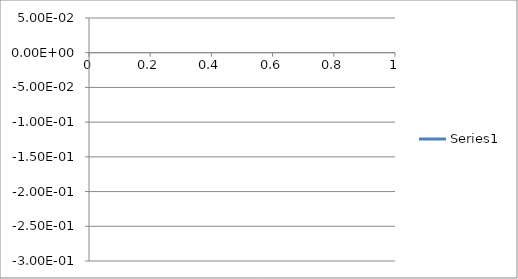
| Category | Series 0 |
|---|---|
| 0 | 0.008 |
| 1 | 0.008 |
| 2 | 0.008 |
| 3 | 0.008 |
| 4 | 0.008 |
| 5 | 0.008 |
| 6 | 0.008 |
| 7 | 0.008 |
| 8 | 0.008 |
| 9 | 0.007 |
| 10 | 0.007 |
| 11 | 0.007 |
| 12 | 0.007 |
| 13 | 0.007 |
| 14 | 0.007 |
| 15 | 0.008 |
| 16 | 0.008 |
| 17 | 0.008 |
| 18 | 0.008 |
| 19 | 0.008 |
| 20 | 0.008 |
| 21 | 0.008 |
| 22 | 0.008 |
| 23 | 0.008 |
| 24 | 0.008 |
| 25 | 0.008 |
| 26 | 0.008 |
| 27 | 0.008 |
| 28 | 0.008 |
| 29 | 0.008 |
| 30 | 0.008 |
| 31 | 0.008 |
| 32 | 0.008 |
| 33 | 0.008 |
| 34 | 0.008 |
| 35 | 0.008 |
| 36 | 0.008 |
| 37 | 0.008 |
| 38 | 0.008 |
| 39 | 0.008 |
| 40 | 0.008 |
| 41 | 0.007 |
| 42 | 0.007 |
| 43 | 0.007 |
| 44 | 0.007 |
| 45 | 0.007 |
| 46 | 0.007 |
| 47 | 0.007 |
| 48 | 0.007 |
| 49 | 0.007 |
| 50 | 0.007 |
| 51 | 0.007 |
| 52 | 0.007 |
| 53 | 0.007 |
| 54 | 0.007 |
| 55 | 0.007 |
| 56 | 0.007 |
| 57 | 0.007 |
| 58 | 0.007 |
| 59 | 0.007 |
| 60 | 0.007 |
| 61 | 0.007 |
| 62 | 0.007 |
| 63 | 0.007 |
| 64 | 0.007 |
| 65 | 0.007 |
| 66 | 0.006 |
| 67 | 0.004 |
| 68 | 0 |
| 69 | -0.006 |
| 70 | -0.015 |
| 71 | -0.027 |
| 72 | -0.042 |
| 73 | -0.057 |
| 74 | -0.072 |
| 75 | -0.086 |
| 76 | -0.1 |
| 77 | -0.117 |
| 78 | -0.138 |
| 79 | -0.16 |
| 80 | -0.183 |
| 81 | -0.204 |
| 82 | -0.223 |
| 83 | -0.238 |
| 84 | -0.248 |
| 85 | -0.253 |
| 86 | -0.251 |
| 87 | -0.244 |
| 88 | -0.232 |
| 89 | -0.218 |
| 90 | -0.202 |
| 91 | -0.185 |
| 92 | -0.17 |
| 93 | -0.157 |
| 94 | -0.149 |
| 95 | -0.145 |
| 96 | -0.145 |
| 97 | -0.148 |
| 98 | -0.151 |
| 99 | -0.152 |
| 100 | -0.152 |
| 101 | -0.148 |
| 102 | -0.142 |
| 103 | -0.133 |
| 104 | -0.124 |
| 105 | -0.115 |
| 106 | -0.108 |
| 107 | -0.103 |
| 108 | -0.101 |
| 109 | -0.1 |
| 110 | -0.1 |
| 111 | -0.099 |
| 112 | -0.099 |
| 113 | -0.099 |
| 114 | -0.098 |
| 115 | -0.097 |
| 116 | -0.097 |
| 117 | -0.096 |
| 118 | -0.095 |
| 119 | -0.095 |
| 120 | -0.094 |
| 121 | -0.093 |
| 122 | -0.092 |
| 123 | -0.091 |
| 124 | -0.09 |
| 125 | -0.089 |
| 126 | -0.086 |
| 127 | -0.083 |
| 128 | -0.079 |
| 129 | -0.074 |
| 130 | -0.068 |
| 131 | -0.063 |
| 132 | -0.059 |
| 133 | -0.055 |
| 134 | -0.052 |
| 135 | -0.05 |
| 136 | -0.049 |
| 137 | -0.049 |
| 138 | -0.049 |
| 139 | -0.05 |
| 140 | -0.051 |
| 141 | -0.052 |
| 142 | -0.052 |
| 143 | -0.052 |
| 144 | -0.052 |
| 145 | -0.052 |
| 146 | -0.052 |
| 147 | -0.051 |
| 148 | -0.051 |
| 149 | -0.051 |
| 150 | -0.05 |
| 151 | -0.049 |
| 152 | -0.048 |
| 153 | -0.046 |
| 154 | -0.043 |
| 155 | -0.041 |
| 156 | -0.038 |
| 157 | -0.035 |
| 158 | -0.032 |
| 159 | -0.029 |
| 160 | -0.027 |
| 161 | -0.026 |
| 162 | -0.025 |
| 163 | -0.025 |
| 164 | -0.024 |
| 165 | -0.024 |
| 166 | -0.025 |
| 167 | -0.025 |
| 168 | -0.025 |
| 169 | -0.025 |
| 170 | -0.025 |
| 171 | -0.026 |
| 172 | -0.026 |
| 173 | -0.028 |
| 174 | -0.029 |
| 175 | -0.032 |
| 176 | -0.034 |
| 177 | -0.036 |
| 178 | -0.038 |
| 179 | -0.039 |
| 180 | -0.039 |
| 181 | -0.038 |
| 182 | -0.037 |
| 183 | -0.034 |
| 184 | -0.031 |
| 185 | -0.028 |
| 186 | -0.025 |
| 187 | -0.022 |
| 188 | -0.019 |
| 189 | -0.016 |
| 190 | -0.014 |
| 191 | -0.011 |
| 192 | -0.008 |
| 193 | -0.007 |
| 194 | -0.006 |
| 195 | -0.005 |
| 196 | -0.006 |
| 197 | -0.006 |
| 198 | -0.007 |
| 199 | -0.008 |
| 200 | -0.009 |
| 201 | -0.01 |
| 202 | -0.012 |
| 203 | -0.013 |
| 204 | -0.015 |
| 205 | -0.017 |
| 206 | -0.018 |
| 207 | -0.019 |
| 208 | -0.02 |
| 209 | -0.02 |
| 210 | -0.02 |
| 211 | -0.02 |
| 212 | -0.019 |
| 213 | -0.019 |
| 214 | -0.019 |
| 215 | -0.019 |
| 216 | -0.019 |
| 217 | -0.018 |
| 218 | -0.017 |
| 219 | -0.016 |
| 220 | -0.016 |
| 221 | -0.015 |
| 222 | -0.014 |
| 223 | -0.013 |
| 224 | -0.012 |
| 225 | -0.011 |
| 226 | -0.01 |
| 227 | -0.009 |
| 228 | -0.008 |
| 229 | -0.008 |
| 230 | -0.008 |
| 231 | -0.008 |
| 232 | -0.008 |
| 233 | -0.009 |
| 234 | -0.009 |
| 235 | -0.01 |
| 236 | -0.01 |
| 237 | -0.009 |
| 238 | -0.009 |
| 239 | -0.008 |
| 240 | -0.007 |
| 241 | -0.007 |
| 242 | -0.006 |
| 243 | -0.005 |
| 244 | -0.004 |
| 245 | -0.003 |
| 246 | -0.002 |
| 247 | 0 |
| 248 | 0.001 |
| 249 | 0.002 |
| 250 | 0.002 |
| 251 | 0.002 |
| 252 | 0.002 |
| 253 | 0.002 |
| 254 | 0.001 |
| 255 | 0.001 |
| 256 | 0.001 |
| 257 | 0 |
| 258 | -0.001 |
| 259 | -0.001 |
| 260 | -0.002 |
| 261 | -0.003 |
| 262 | -0.004 |
| 263 | -0.004 |
| 264 | -0.004 |
| 265 | -0.004 |
| 266 | -0.004 |
| 267 | -0.004 |
| 268 | -0.003 |
| 269 | -0.002 |
| 270 | -0.001 |
| 271 | 0 |
| 272 | 0.001 |
| 273 | 0.002 |
| 274 | 0.003 |
| 275 | 0.004 |
| 276 | 0.005 |
| 277 | 0.006 |
| 278 | 0.006 |
| 279 | 0.007 |
| 280 | 0.008 |
| 281 | 0.008 |
| 282 | 0.009 |
| 283 | 0.009 |
| 284 | 0.009 |
| 285 | 0.009 |
| 286 | 0.008 |
| 287 | 0.008 |
| 288 | 0.007 |
| 289 | 0.006 |
| 290 | 0.006 |
| 291 | 0.005 |
| 292 | 0.005 |
| 293 | 0.004 |
| 294 | 0.004 |
| 295 | 0.003 |
| 296 | 0.003 |
| 297 | 0.002 |
| 298 | 0.002 |
| 299 | 0.002 |
| 300 | 0.003 |
| 301 | 0.003 |
| 302 | 0.004 |
| 303 | 0.004 |
| 304 | 0.005 |
| 305 | 0.006 |
| 306 | 0.006 |
| 307 | 0.007 |
| 308 | 0.007 |
| 309 | 0.007 |
| 310 | 0.008 |
| 311 | 0.008 |
| 312 | 0.008 |
| 313 | 0.008 |
| 314 | 0.008 |
| 315 | 0.008 |
| 316 | 0.007 |
| 317 | 0.007 |
| 318 | 0.006 |
| 319 | 0.005 |
| 320 | 0.004 |
| 321 | 0.003 |
| 322 | 0.003 |
| 323 | 0.002 |
| 324 | 0.002 |
| 325 | 0.001 |
| 326 | 0.001 |
| 327 | 0.001 |
| 328 | 0.002 |
| 329 | 0.002 |
| 330 | 0.002 |
| 331 | 0.003 |
| 332 | 0.003 |
| 333 | 0.004 |
| 334 | 0.004 |
| 335 | 0.005 |
| 336 | 0.006 |
| 337 | 0.007 |
| 338 | 0.007 |
| 339 | 0.008 |
| 340 | 0.008 |
| 341 | 0.008 |
| 342 | 0.009 |
| 343 | 0.009 |
| 344 | 0.009 |
| 345 | 0.009 |
| 346 | 0.009 |
| 347 | 0.009 |
| 348 | 0.009 |
| 349 | 0.009 |
| 350 | 0.009 |
| 351 | 0.009 |
| 352 | 0.009 |
| 353 | 0.009 |
| 354 | 0.009 |
| 355 | 0.009 |
| 356 | 0.009 |
| 357 | 0.009 |
| 358 | 0.009 |
| 359 | 0.009 |
| 360 | 0.009 |
| 361 | 0.009 |
| 362 | 0.009 |
| 363 | 0.009 |
| 364 | 0.009 |
| 365 | 0.009 |
| 366 | 0.009 |
| 367 | 0.009 |
| 368 | 0.009 |
| 369 | 0.009 |
| 370 | 0.009 |
| 371 | 0.009 |
| 372 | 0.009 |
| 373 | 0.009 |
| 374 | 0.009 |
| 375 | 0.009 |
| 376 | 0.009 |
| 377 | 0.009 |
| 378 | 0.009 |
| 379 | 0.009 |
| 380 | 0.009 |
| 381 | 0.009 |
| 382 | 0.009 |
| 383 | 0.009 |
| 384 | 0.009 |
| 385 | 0.009 |
| 386 | 0.009 |
| 387 | 0.009 |
| 388 | 0.009 |
| 389 | 0.009 |
| 390 | 0.009 |
| 391 | 0.009 |
| 392 | 0.009 |
| 393 | 0.009 |
| 394 | 0.009 |
| 395 | 0.009 |
| 396 | 0.009 |
| 397 | 0.009 |
| 398 | 0.009 |
| 399 | 0.009 |
| 400 | 0.009 |